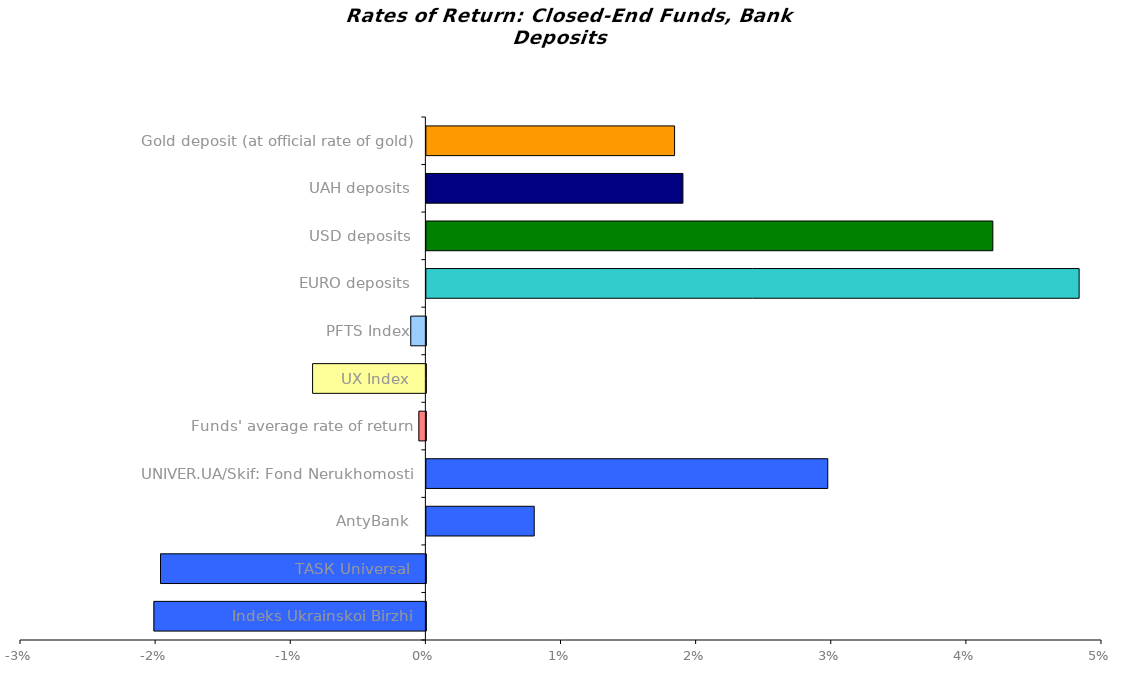
| Category | Series 0 |
|---|---|
| Indeks Ukrainskoi Birzhi | -0.02 |
| ТАSК Universal | -0.02 |
| AntyBank | 0.008 |
| UNIVER.UA/Skif: Fond Nerukhomosti | 0.03 |
| Funds' average rate of return | -0.001 |
| UX Index | -0.008 |
| PFTS Index | -0.001 |
| EURO deposits | 0.048 |
| USD deposits | 0.042 |
| UAH deposits | 0.019 |
| Gold deposit (at official rate of gold) | 0.018 |